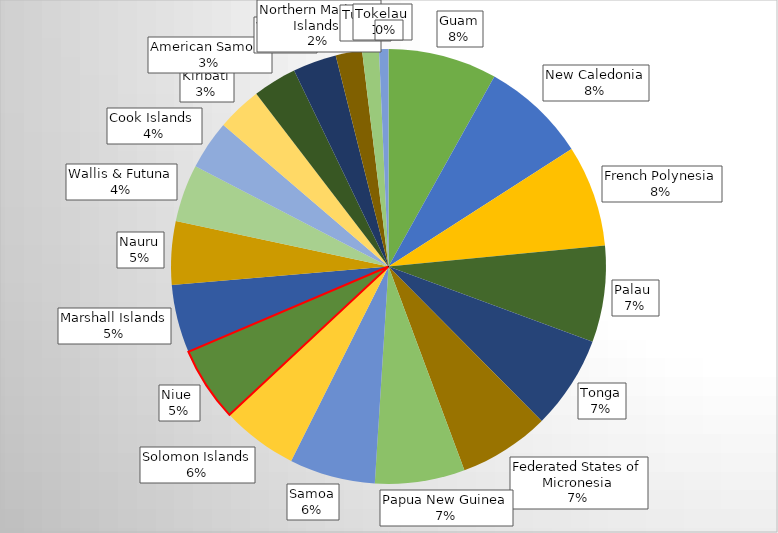
| Category | Series 0 |
|---|---|
| Guam | 487 |
| New Caledonia | 471 |
| French Polynesia | 454 |
| Palau  | 431 |
| Tonga | 417 |
| Federated States of Micronesia | 407 |
| Papua New Guinea | 402 |
| Samoa | 384 |
| Solomon Islands | 341 |
| Niue  | 333 |
| Marshall Islands | 304 |
| Nauru | 284 |
| Wallis & Futuna | 256 |
| Cook Islands  | 220 |
| Kiribati | 200 |
| American Samoa  | 196 |
| Vanuatu | 195 |
| Northern Mariana Islands  | 118 |
| Tuvalu | 75 |
| Tokelau | 42 |